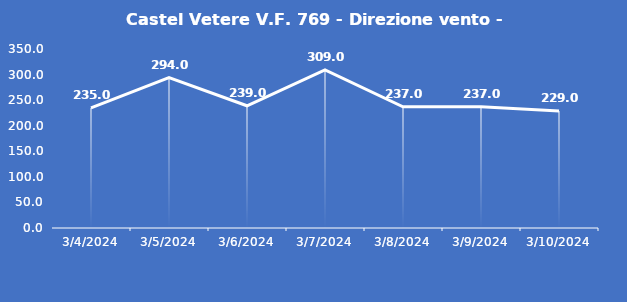
| Category | Castel Vetere V.F. 769 - Direzione vento - Grezzo (°N) |
|---|---|
| 3/4/24 | 235 |
| 3/5/24 | 294 |
| 3/6/24 | 239 |
| 3/7/24 | 309 |
| 3/8/24 | 237 |
| 3/9/24 | 237 |
| 3/10/24 | 229 |